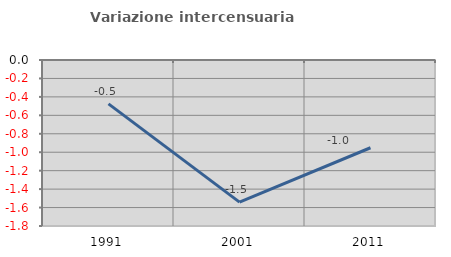
| Category | Variazione intercensuaria annua |
|---|---|
| 1991.0 | -0.475 |
| 2001.0 | -1.541 |
| 2011.0 | -0.952 |